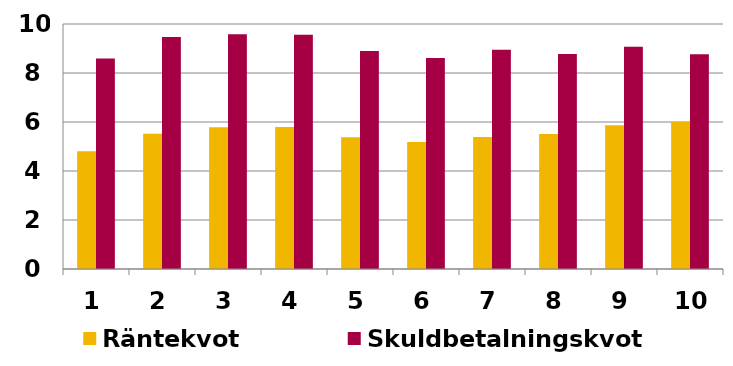
| Category | Räntekvot | Skuldbetalningskvot |
|---|---|---|
| 1.0 | 4.809 | 8.587 |
| 2.0 | 5.524 | 9.47 |
| 3.0 | 5.791 | 9.583 |
| 4.0 | 5.797 | 9.56 |
| 5.0 | 5.373 | 8.901 |
| 6.0 | 5.187 | 8.612 |
| 7.0 | 5.393 | 8.946 |
| 8.0 | 5.507 | 8.772 |
| 9.0 | 5.867 | 9.07 |
| 10.0 | 5.999 | 8.764 |